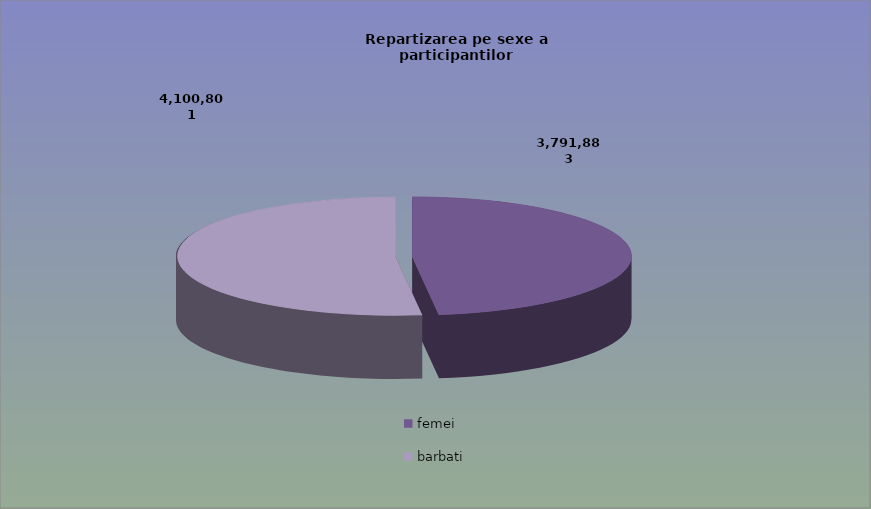
| Category | Series 0 |
|---|---|
| femei | 3791883 |
| barbati | 4100801 |